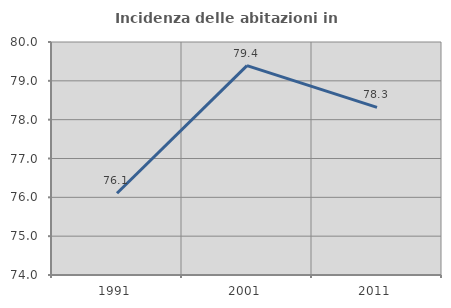
| Category | Incidenza delle abitazioni in proprietà  |
|---|---|
| 1991.0 | 76.106 |
| 2001.0 | 79.391 |
| 2011.0 | 78.316 |